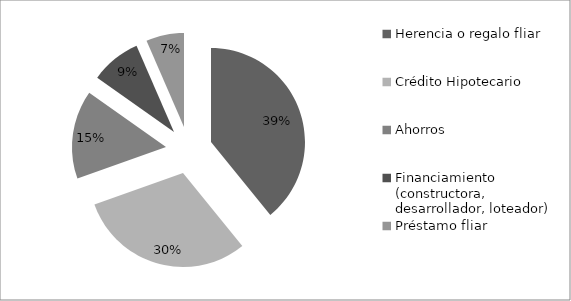
| Category | Series 0 |
|---|---|
| Herencia o regalo fliar  | 18 |
| Crédito Hipotecario | 14 |
| Ahorros | 7 |
| Financiamiento (constructora, desarrollador, loteador) | 4 |
| Préstamo fliar | 3 |